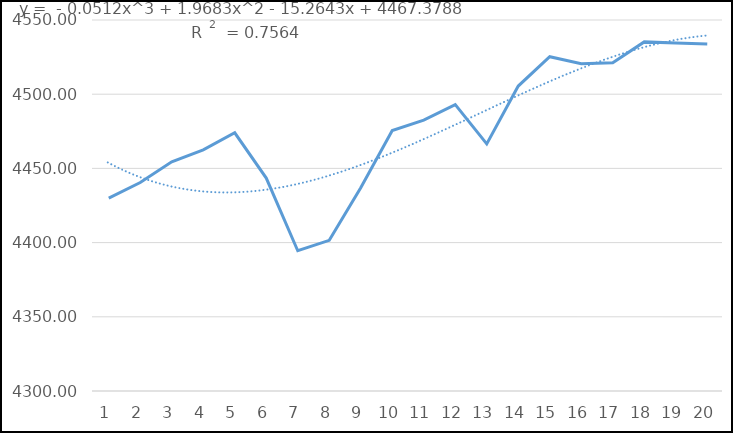
| Category | Series 0 |
|---|---|
| 0 | 4430 |
| 1 | 4440.5 |
| 2 | 4454.5 |
| 3 | 4462.5 |
| 4 | 4474 |
| 5 | 4443.5 |
| 6 | 4394.5 |
| 7 | 4401.5 |
| 8 | 4437 |
| 9 | 4475.5 |
| 10 | 4482.5 |
| 11 | 4493 |
| 12 | 4466.5 |
| 13 | 4505.5 |
| 14 | 4525.25 |
| 15 | 4520.5 |
| 16 | 4521.25 |
| 17 | 4535.25 |
| 18 | 4534.5 |
| 19 | 4533.75 |